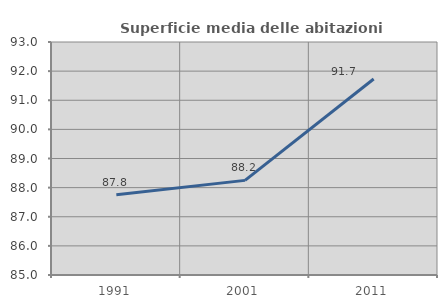
| Category | Superficie media delle abitazioni occupate |
|---|---|
| 1991.0 | 87.752 |
| 2001.0 | 88.249 |
| 2011.0 | 91.728 |